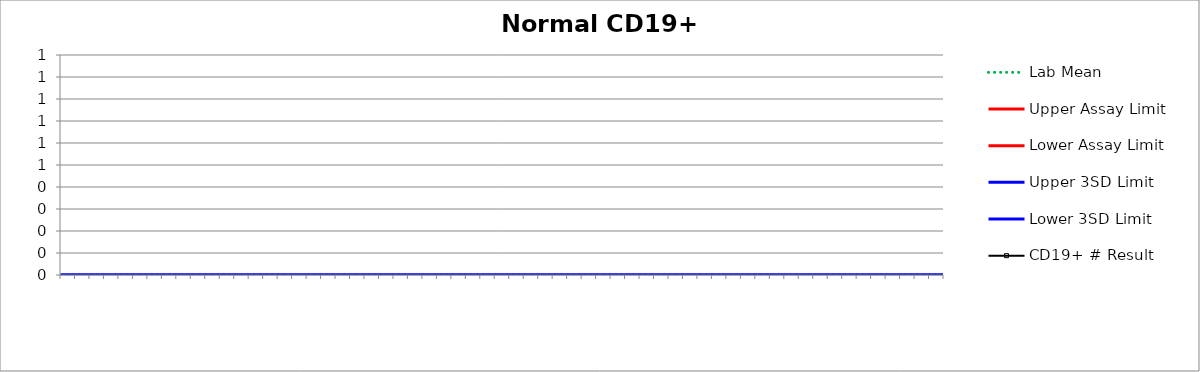
| Category | Lab Mean | Upper Assay Limit | Lower Assay Limit | Upper 3SD Limit | Lower 3SD Limit | CD19+ # Result |
|---|---|---|---|---|---|---|
|  | 0 |  |  | 0 | 0 |  |
|  | 0 |  |  | 0 | 0 |  |
|  | 0 |  |  | 0 | 0 |  |
|  | 0 |  |  | 0 | 0 |  |
|  | 0 |  |  | 0 | 0 |  |
|  | 0 |  |  | 0 | 0 |  |
|  | 0 |  |  | 0 | 0 |  |
|  | 0 |  |  | 0 | 0 |  |
|  | 0 |  |  | 0 | 0 |  |
|  | 0 |  |  | 0 | 0 |  |
|  | 0 |  |  | 0 | 0 |  |
|  | 0 |  |  | 0 | 0 |  |
|  | 0 |  |  | 0 | 0 |  |
|  | 0 |  |  | 0 | 0 |  |
|  | 0 |  |  | 0 | 0 |  |
|  | 0 |  |  | 0 | 0 |  |
|  | 0 |  |  | 0 | 0 |  |
|  | 0 |  |  | 0 | 0 |  |
|  | 0 |  |  | 0 | 0 |  |
|  | 0 |  |  | 0 | 0 |  |
|  | 0 |  |  | 0 | 0 |  |
|  | 0 |  |  | 0 | 0 |  |
|  | 0 |  |  | 0 | 0 |  |
|  | 0 |  |  | 0 | 0 |  |
|  | 0 |  |  | 0 | 0 |  |
|  | 0 |  |  | 0 | 0 |  |
|  | 0 |  |  | 0 | 0 |  |
|  | 0 |  |  | 0 | 0 |  |
|  | 0 |  |  | 0 | 0 |  |
|  | 0 |  |  | 0 | 0 |  |
|  | 0 |  |  | 0 | 0 |  |
|  | 0 |  |  | 0 | 0 |  |
|  | 0 |  |  | 0 | 0 |  |
|  | 0 |  |  | 0 | 0 |  |
|  | 0 |  |  | 0 | 0 |  |
|  | 0 |  |  | 0 | 0 |  |
|  | 0 |  |  | 0 | 0 |  |
|  | 0 |  |  | 0 | 0 |  |
|  | 0 |  |  | 0 | 0 |  |
|  | 0 |  |  | 0 | 0 |  |
|  | 0 |  |  | 0 | 0 |  |
|  | 0 |  |  | 0 | 0 |  |
|  | 0 |  |  | 0 | 0 |  |
|  | 0 |  |  | 0 | 0 |  |
|  | 0 |  |  | 0 | 0 |  |
|  | 0 |  |  | 0 | 0 |  |
|  | 0 |  |  | 0 | 0 |  |
|  | 0 |  |  | 0 | 0 |  |
|  | 0 |  |  | 0 | 0 |  |
|  | 0 |  |  | 0 | 0 |  |
|  | 0 |  |  | 0 | 0 |  |
|  | 0 |  |  | 0 | 0 |  |
|  | 0 |  |  | 0 | 0 |  |
|  | 0 |  |  | 0 | 0 |  |
|  | 0 |  |  | 0 | 0 |  |
|  | 0 |  |  | 0 | 0 |  |
|  | 0 |  |  | 0 | 0 |  |
|  | 0 |  |  | 0 | 0 |  |
|  | 0 |  |  | 0 | 0 |  |
|  | 0 |  |  | 0 | 0 |  |
|  | 0 |  |  | 0 | 0 |  |
|  | 0 |  |  | 0 | 0 |  |